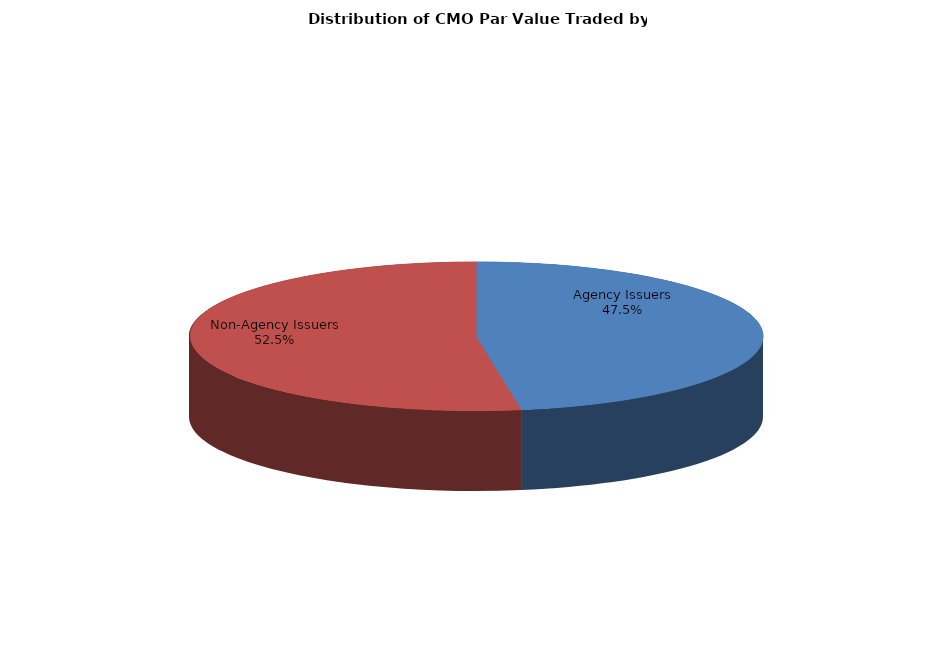
| Category | Series 0 |
|---|---|
| Agency Issuers | 6065536849.065 |
| Non-Agency Issuers | 6712848803.227 |